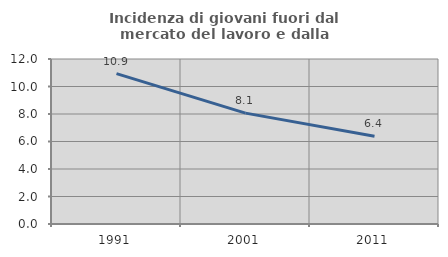
| Category | Incidenza di giovani fuori dal mercato del lavoro e dalla formazione  |
|---|---|
| 1991.0 | 10.938 |
| 2001.0 | 8.065 |
| 2011.0 | 6.383 |